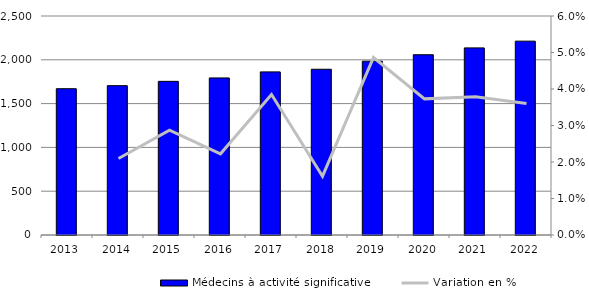
| Category | Médecins à activité significative |
|---|---|
| 2013.0 | 1670 |
| 2014.0 | 1705 |
| 2015.0 | 1754 |
| 2016.0 | 1793 |
| 2017.0 | 1862 |
| 2018.0 | 1892 |
| 2019.0 | 1984 |
| 2020.0 | 2058 |
| 2021.0 | 2136 |
| 2022.0 | 2213 |